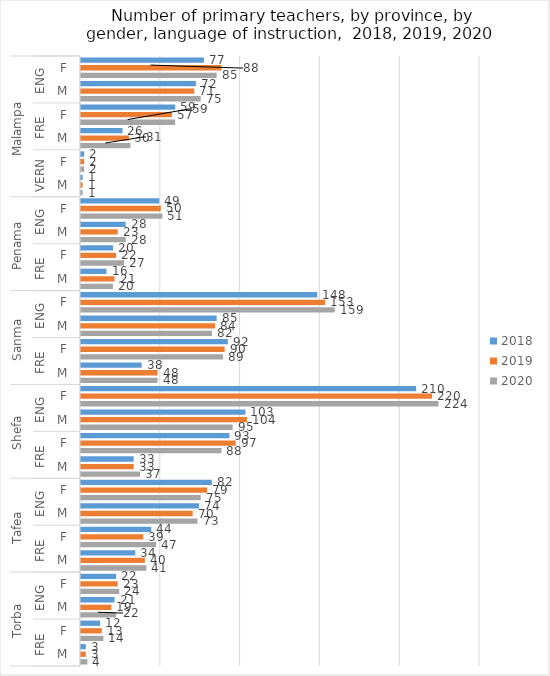
| Category | 2018 | 2019 | 2020 |
|---|---|---|---|
| 0 | 77 | 88 | 85 |
| 1 | 72 | 71 | 75 |
| 2 | 59 | 57 | 59 |
| 3 | 26 | 30 | 31 |
| 4 | 2 | 2 | 2 |
| 5 | 1 | 1 | 1 |
| 6 | 49 | 50 | 51 |
| 7 | 28 | 23 | 28 |
| 8 | 20 | 22 | 27 |
| 9 | 16 | 21 | 20 |
| 10 | 148 | 153 | 159 |
| 11 | 85 | 84 | 82 |
| 12 | 92 | 90 | 89 |
| 13 | 38 | 48 | 48 |
| 14 | 210 | 220 | 224 |
| 15 | 103 | 104 | 95 |
| 16 | 93 | 97 | 88 |
| 17 | 33 | 33 | 37 |
| 18 | 82 | 79 | 75 |
| 19 | 74 | 70 | 73 |
| 20 | 44 | 39 | 47 |
| 21 | 34 | 40 | 41 |
| 22 | 22 | 23 | 24 |
| 23 | 21 | 19 | 22 |
| 24 | 12 | 13 | 14 |
| 25 | 3 | 3 | 4 |